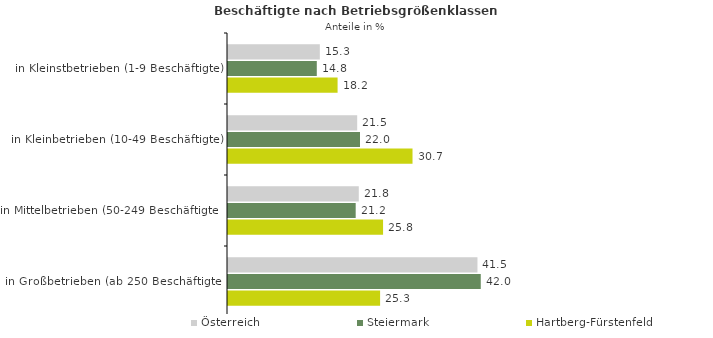
| Category | Österreich | Steiermark | Hartberg-Fürstenfeld |
|---|---|---|---|
| in Kleinstbetrieben (1-9 Beschäftigte) | 15.273 | 14.768 | 18.225 |
| in Kleinbetrieben (10-49 Beschäftigte) | 21.487 | 21.955 | 30.689 |
| in Mittelbetrieben (50-249 Beschäftigte) | 21.75 | 21.237 | 25.791 |
| in Großbetrieben (ab 250 Beschäftigte) | 41.489 | 42.04 | 25.296 |